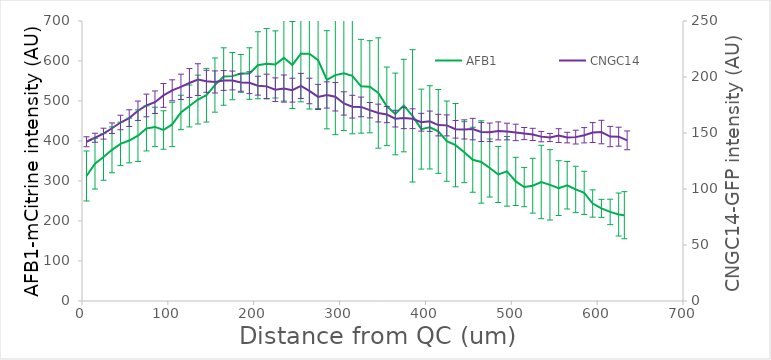
| Category | AFB1 |
|---|---|
| 5.225 | 312.55 |
| 15.125 | 343.302 |
| 25.025 | 360.192 |
| 34.925 | 377.933 |
| 44.825 | 392.824 |
| 55.0 | 401.231 |
| 65.175 | 413.273 |
| 75.0749999999999 | 431.477 |
| 84.975 | 435.23 |
| 94.875 | 427.51 |
| 105.05 | 441.387 |
| 115.225 | 471.358 |
| 125.125 | 487.58 |
| 135.024999999999 | 503.59 |
| 144.925 | 514.435 |
| 154.825 | 539.818 |
| 165.0 | 561.184 |
| 175.175 | 562.174 |
| 185.075 | 568.889 |
| 194.975 | 568.609 |
| 204.875 | 589.335 |
| 215.049999999999 | 593.174 |
| 225.225 | 591.38 |
| 235.125 | 607.905 |
| 245.024999999999 | 590.067 |
| 254.924999999999 | 618.24 |
| 264.825 | 618.304 |
| 275.0 | 602.233 |
| 285.174999999999 | 553.115 |
| 295.075 | 564.692 |
| 304.975 | 569.141 |
| 314.875 | 562.754 |
| 325.05 | 536.807 |
| 335.225 | 535.642 |
| 345.125 | 520.015 |
| 355.025 | 486.63 |
| 364.924999999999 | 467.64 |
| 374.825 | 488.55 |
| 385.0 | 462.882 |
| 395.174999999999 | 429.693 |
| 405.075 | 434.109 |
| 414.975 | 423.973 |
| 424.875 | 399.602 |
| 435.05 | 389.587 |
| 445.225 | 372.083 |
| 455.125 | 353.114 |
| 465.025 | 347.596 |
| 474.924999999999 | 332.473 |
| 484.825 | 316.334 |
| 495.0 | 324.171 |
| 505.174999999999 | 298.976 |
| 515.075 | 284.846 |
| 524.974999999999 | 288.293 |
| 534.875 | 297.572 |
| 545.05 | 290.399 |
| 555.224999999999 | 282.286 |
| 565.125 | 289.394 |
| 575.025 | 278.897 |
| 584.925 | 270.344 |
| 594.825 | 243.698 |
| 605.0 | 231.584 |
| 615.175 | 222.67 |
| 625.075 | 216.143 |
| 631.675 | 214.456 |